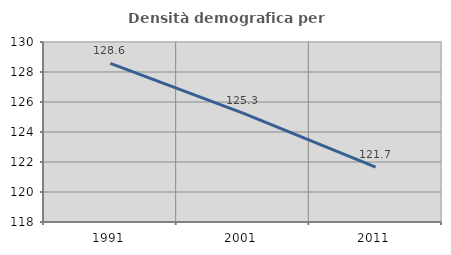
| Category | Densità demografica |
|---|---|
| 1991.0 | 128.571 |
| 2001.0 | 125.259 |
| 2011.0 | 121.655 |